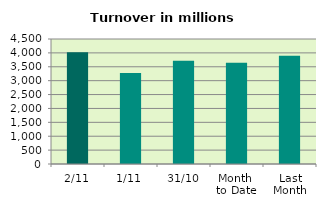
| Category | Series 0 |
|---|---|
| 2/11 | 4023.998 |
| 1/11 | 3274.714 |
| 31/10 | 3718.922 |
| Month 
to Date | 3649.356 |
| Last
Month | 3895.685 |